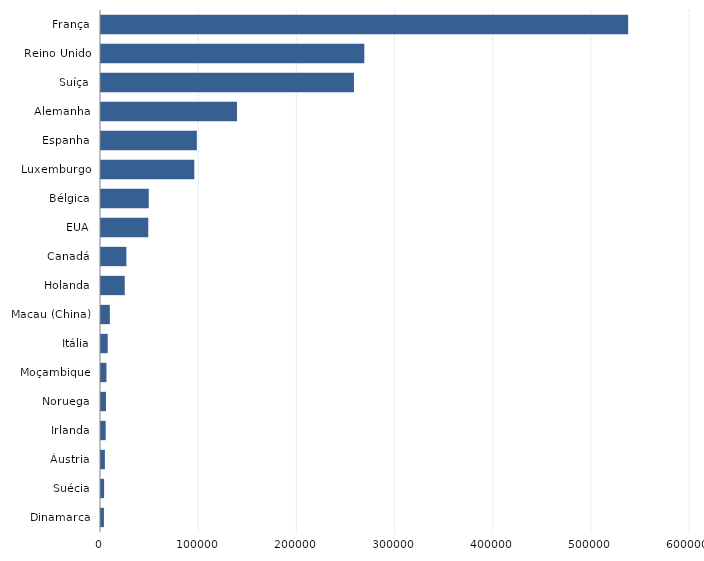
| Category | Series 0 |
|---|---|
| Dinamarca | 2970 |
| Suécia | 3149 |
| Áustria | 3989 |
| Irlanda | 4807 |
| Noruega | 5050 |
| Moçambique | 5560 |
| Itália | 6847 |
| Macau (China) | 9024 |
| Holanda | 24193 |
| Canadá | 25855 |
| EUA | 48158 |
| Bélgica | 48655 |
| Luxemburgo | 95057 |
| Espanha | 97628 |
| Alemanha | 138555 |
| Suíça | 257691 |
| Reino Unido | 268245 |
| França | 537000 |